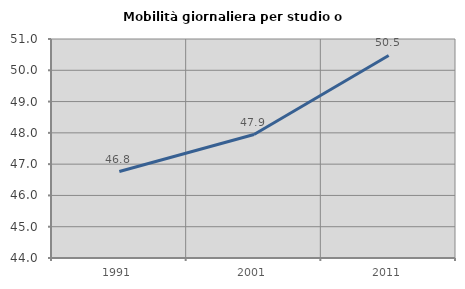
| Category | Mobilità giornaliera per studio o lavoro |
|---|---|
| 1991.0 | 46.763 |
| 2001.0 | 47.945 |
| 2011.0 | 50.473 |